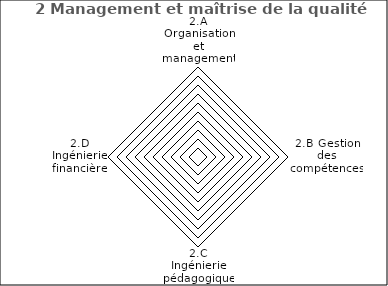
| Category | 2 Management et maîtrise de la qualité |
|---|---|
| 2.A Organisation et management | 0 |
| 2.B Gestion des compétences | 0 |
| 2.C Ingénierie pédagogique | 0 |
| 2.D Ingénierie financière | 0 |